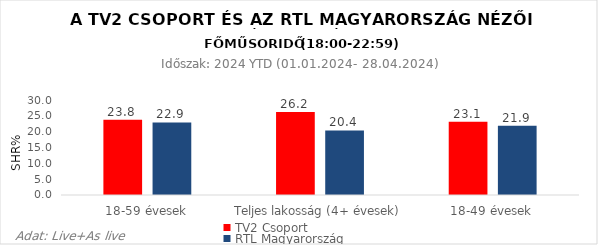
| Category | TV2 Csoport | RTL Magyarország |
|---|---|---|
| 18-59 évesek | 23.8 | 22.9 |
| Teljes lakosság (4+ évesek) | 26.2 | 20.4 |
| 18-49 évesek | 23.1 | 21.9 |